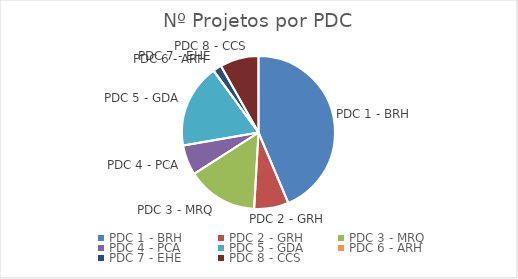
| Category | Nº Projetos |
|---|---|
| PDC 1 - BRH | 96 |
| PDC 2 - GRH | 16 |
| PDC 3 - MRQ | 33 |
| PDC 4 - PCA | 14 |
| PDC 5 - GDA | 39 |
| PDC 6 - ARH | 0 |
| PDC 7 - EHE | 4 |
| PDC 8 - CCS | 18 |